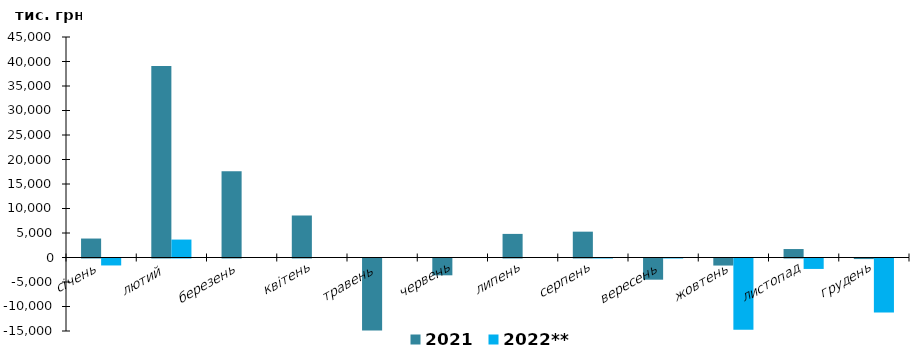
| Category | 2021 | 2022** |
|---|---|---|
| січень | 3870.284 | -1419.798 |
| лютий  | 39078.998 | 3660.614 |
| березень | 17584.613 | 0 |
| квітень | 8556.253 | 0 |
| травень  | -14682.751 | 0 |
| червень | -3430.992 | 0 |
| липень | 4815.189 | 0 |
| серпень | 5272.794 | -0.145 |
| вересень | -4323.731 | -2.047 |
| жовтень | -1437.042 | -14565.502 |
| листопад | 1726.823 | -2128.834 |
| грудень | -114.553 | -11022.039 |